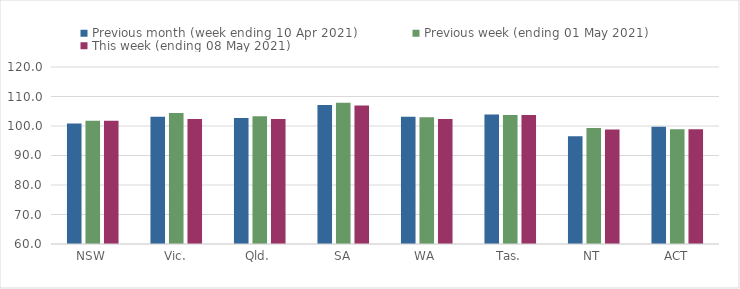
| Category | Previous month (week ending 10 Apr 2021) | Previous week (ending 01 May 2021) | This week (ending 08 May 2021) |
|---|---|---|---|
| NSW | 100.84 | 101.76 | 101.76 |
| Vic. | 103.14 | 104.38 | 102.39 |
| Qld. | 102.67 | 103.29 | 102.35 |
| SA | 107.09 | 107.9 | 106.91 |
| WA | 103.1 | 102.98 | 102.35 |
| Tas. | 103.93 | 103.7 | 103.7 |
| NT | 96.52 | 99.34 | 98.84 |
| ACT | 99.72 | 98.87 | 98.87 |